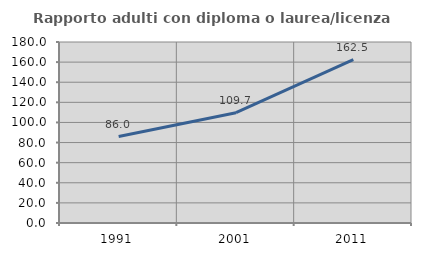
| Category | Rapporto adulti con diploma o laurea/licenza media  |
|---|---|
| 1991.0 | 86.02 |
| 2001.0 | 109.687 |
| 2011.0 | 162.451 |